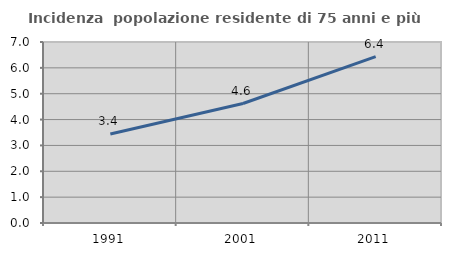
| Category | Incidenza  popolazione residente di 75 anni e più |
|---|---|
| 1991.0 | 3.439 |
| 2001.0 | 4.621 |
| 2011.0 | 6.431 |